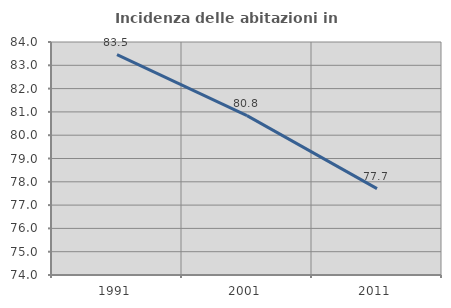
| Category | Incidenza delle abitazioni in proprietà  |
|---|---|
| 1991.0 | 83.462 |
| 2001.0 | 80.838 |
| 2011.0 | 77.708 |